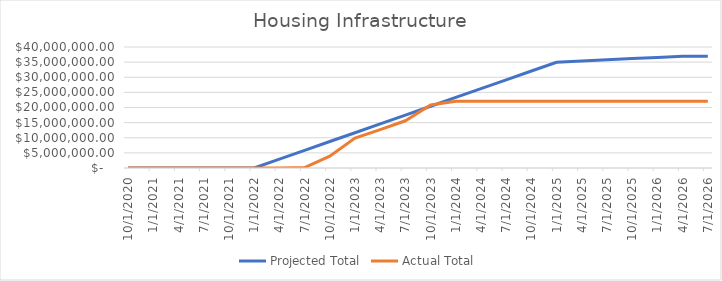
| Category | Projected Total | Actual Total  |
|---|---|---|
| 10/1/20 | 0 | 0 |
| 1/1/21 | 0 | 0 |
| 4/1/21 | 0 | 0 |
| 7/1/21 | 0 | 0 |
| 10/1/21 | 0 | 0 |
| 1/1/22 | 0 | 0 |
| 4/1/22 | 2915785.876 | 0 |
| 7/1/22 | 5831571.752 | 133679 |
| 10/1/22 | 8747357.628 | 3922122 |
| 1/1/23 | 11663143.503 | 9871302.19 |
| 4/1/23 | 14578929.379 | 12702467.33 |
| 7/1/23 | 17494715.255 | 15614433.43 |
| 10/1/23 | 20410501.131 | 20856343.19 |
| 1/1/24 | 23326287.007 | 22072512.92 |
| 4/1/24 | 26242072.883 | 22072512.92 |
| 7/1/24 | 29157858.759 | 22072512.92 |
| 10/1/24 | 32073644.635 | 22072512.92 |
| 1/1/25 | 34961894.524 | 22072512.92 |
| 4/1/25 | 35363302.465 | 22072512.92 |
| 7/1/25 | 35764710.406 | 22072512.92 |
| 10/1/25 | 36166118.348 | 22072512.92 |
| 1/1/26 | 36567526.289 | 22072512.92 |
| 4/1/26 | 36968934.23 | 22072512.92 |
| 7/1/26 | 36968934.23 | 22072512.92 |